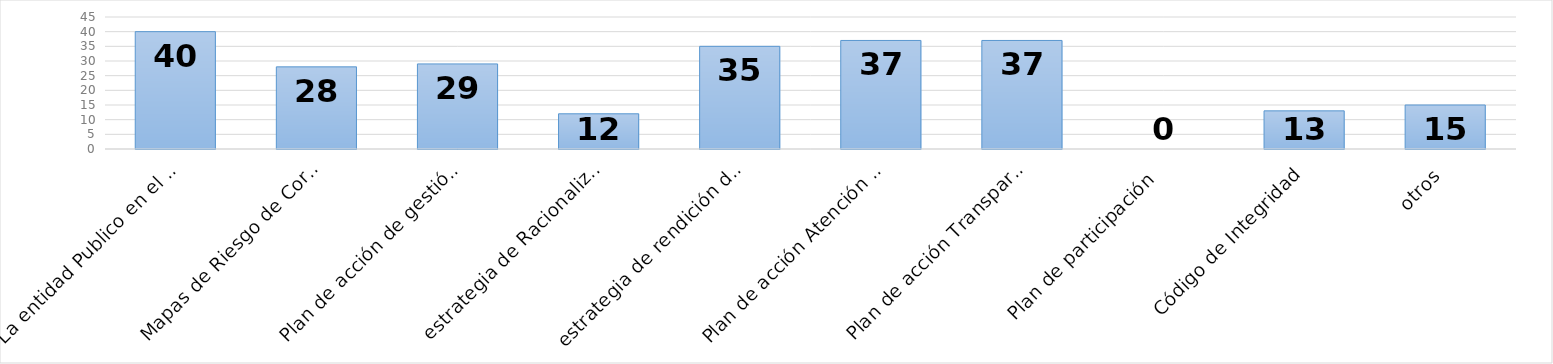
| Category | Series 0 |
|---|---|
| La entidad Publico en el portal web el PAAC 2020 | 40 |
|  Mapas de Riesgo de Corrupción  | 28 |
| Plan de acción de gestión de riesgo de corrupción  | 29 |
| estrategia de Racionalización de Tramites | 12 |
| estrategia de rendición de cuentas | 35 |
| Plan de acción Atención al ciudadano | 37 |
| Plan de acción Transparencia y Acceso a la información  | 37 |
| Plan de participación  | 0 |
| Código de Integridad | 13 |
| otros | 15 |